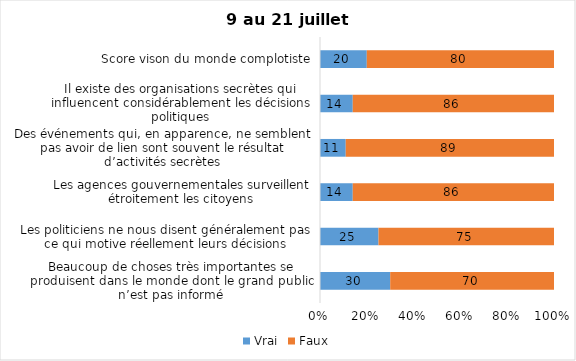
| Category | Vrai | Faux |
|---|---|---|
| Beaucoup de choses très importantes se produisent dans le monde dont le grand public n’est pas informé | 30 | 70 |
| Les politiciens ne nous disent généralement pas ce qui motive réellement leurs décisions | 25 | 75 |
| Les agences gouvernementales surveillent étroitement les citoyens | 14 | 86 |
| Des événements qui, en apparence, ne semblent pas avoir de lien sont souvent le résultat d’activités secrètes | 11 | 89 |
| Il existe des organisations secrètes qui influencent considérablement les décisions politiques | 14 | 86 |
| Score vison du monde complotiste | 20 | 80 |